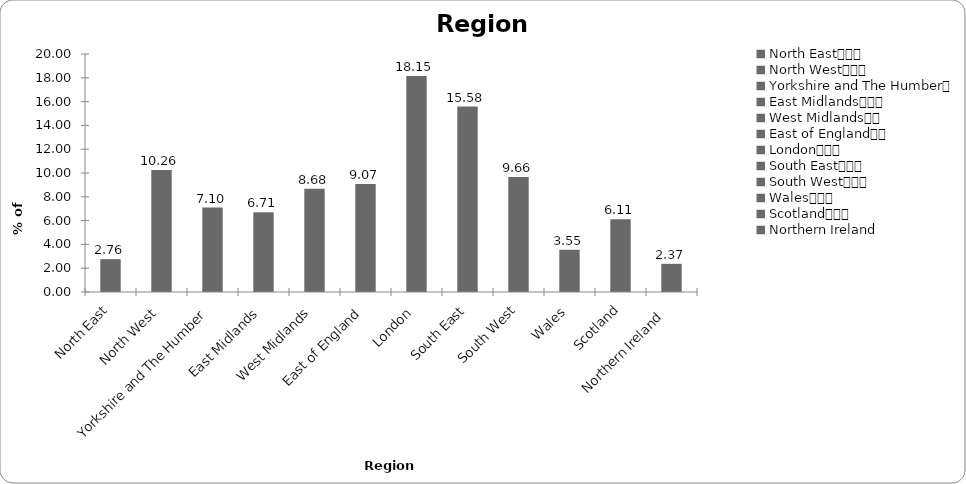
| Category | Region |
|---|---|
| North East			 | 2.761 |
| North West			 | 10.256 |
| Yorkshire and The Humber	 | 7.101 |
| East Midlands			 | 6.706 |
| West Midlands		 | 8.679 |
| East of England		 | 9.073 |
| London			 | 18.146 |
| South East			 | 15.582 |
| South West			 | 9.665 |
| Wales			 | 3.55 |
| Scotland			 | 6.114 |
| Northern Ireland  | 2.367 |